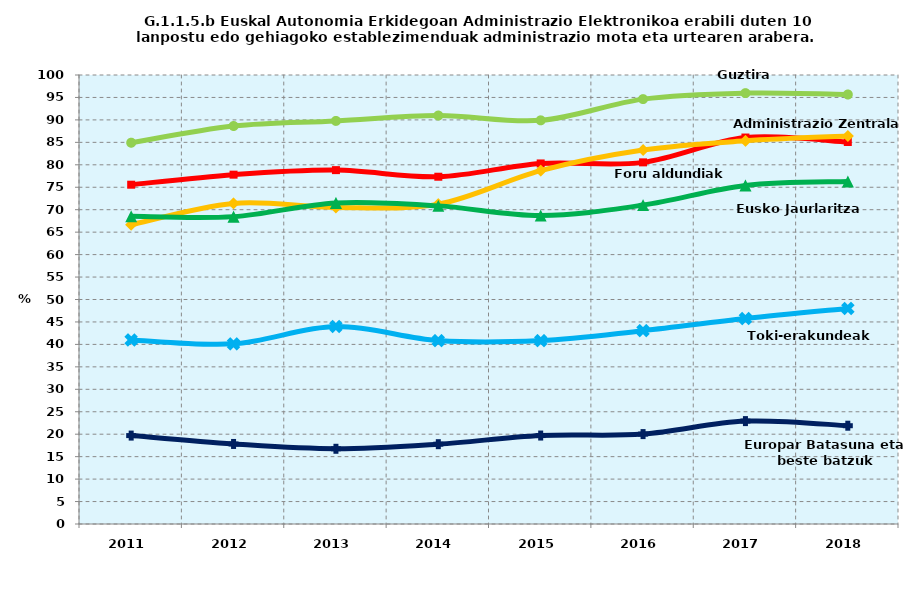
| Category | Guztira | Foru aldundiak | Administrazio Zentrala | Eusko Jaurlaritza | Toki-erakundeak | Europar Batasuna eta beste batzuk |
|---|---|---|---|---|---|---|
| 2011.0 | 84.919 | 75.566 | 66.635 | 68.518 | 40.99 | 19.69 |
| 2012.0 | 88.639 | 77.803 | 71.399 | 68.457 | 40.12 | 17.825 |
| 2013.0 | 89.774 | 78.814 | 70.5 | 71.513 | 43.99 | 16.752 |
| 2014.0 | 90.972 | 77.343 | 71.245 | 70.852 | 40.845 | 17.779 |
| 2015.0 | 89.9 | 80.3 | 78.7 | 68.7 | 40.845 | 19.7 |
| 2016.0 | 94.63 | 80.543 | 83.285 | 71.025 | 43.062 | 20.023 |
| 2017.0 | 95.964 | 86.074 | 85.341 | 75.396 | 45.758 | 22.918 |
| 2018.0 | 95.655 | 85.076 | 86.41 | 76.28 | 48.003 | 21.89 |